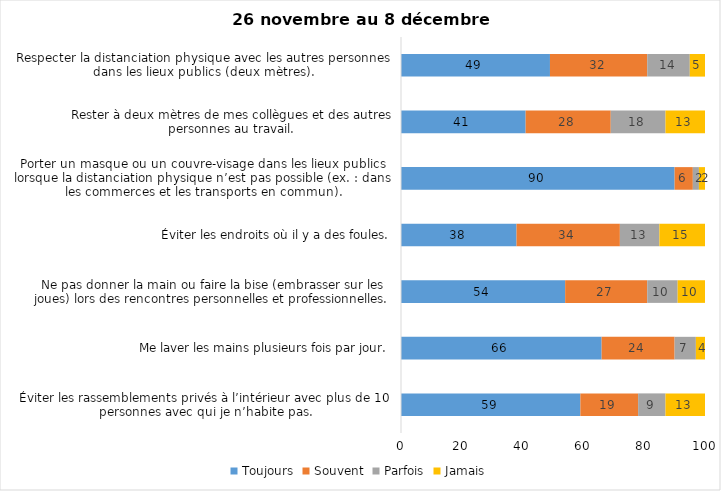
| Category | Toujours | Souvent | Parfois | Jamais |
|---|---|---|---|---|
| Éviter les rassemblements privés à l’intérieur avec plus de 10 personnes avec qui je n’habite pas. | 59 | 19 | 9 | 13 |
| Me laver les mains plusieurs fois par jour. | 66 | 24 | 7 | 4 |
| Ne pas donner la main ou faire la bise (embrasser sur les joues) lors des rencontres personnelles et professionnelles. | 54 | 27 | 10 | 10 |
| Éviter les endroits où il y a des foules. | 38 | 34 | 13 | 15 |
| Porter un masque ou un couvre-visage dans les lieux publics lorsque la distanciation physique n’est pas possible (ex. : dans les commerces et les transports en commun). | 90 | 6 | 2 | 2 |
| Rester à deux mètres de mes collègues et des autres personnes au travail. | 41 | 28 | 18 | 13 |
| Respecter la distanciation physique avec les autres personnes dans les lieux publics (deux mètres). | 49 | 32 | 14 | 5 |